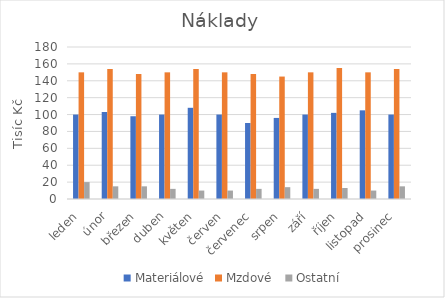
| Category | Materiálové | Mzdové  | Ostatní |
|---|---|---|---|
| leden | 100 | 150 | 20 |
| únor | 103 | 154 | 15 |
| březen | 98 | 148 | 15 |
| duben | 100 | 150 | 12 |
| květen | 108 | 154 | 10 |
| červen | 100 | 150 | 10 |
| červenec | 90 | 148 | 12 |
| srpen | 96 | 145 | 14 |
| září | 100 | 150 | 12 |
| říjen | 102 | 155 | 13 |
| listopad | 105 | 150 | 10 |
| prosinec | 100 | 154 | 15 |